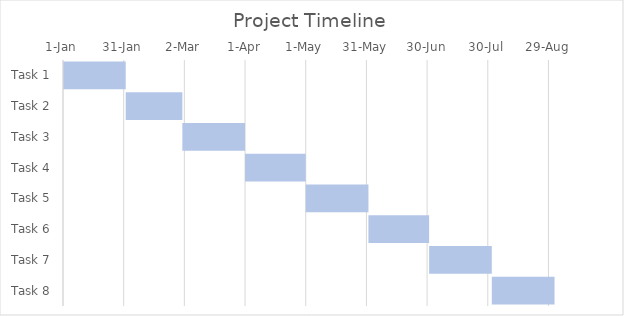
| Category | Start Date | Duration |
|---|---|---|
| Task 1 | 2019-01-01 | 31 |
| Task 2 | 2019-02-01 | 28 |
| Task 3 | 2019-03-01 | 31 |
| Task 4 | 2019-04-01 | 30 |
| Task 5 | 2019-05-01 | 31 |
| Task 6 | 2019-06-01 | 30 |
| Task 7 | 2019-07-01 | 31 |
| Task 8 | 2019-08-01 | 31 |